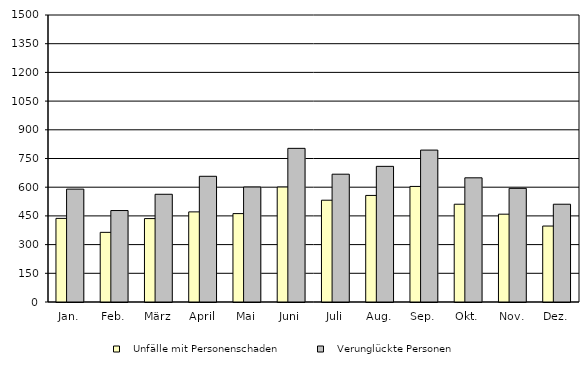
| Category |    Unfälle mit Personenschaden |    Verunglückte Personen |
|---|---|---|
| Jan. | 437 | 590 |
| Feb. | 364 | 478 |
| März | 436 | 563 |
| April | 471 | 657 |
| Mai | 462 | 601 |
| Juni | 601 | 803 |
| Juli | 532 | 668 |
| Aug. | 557 | 709 |
| Sep. | 604 | 794 |
| Okt. | 511 | 649 |
| Nov. | 459 | 594 |
| Dez. | 397 | 511 |